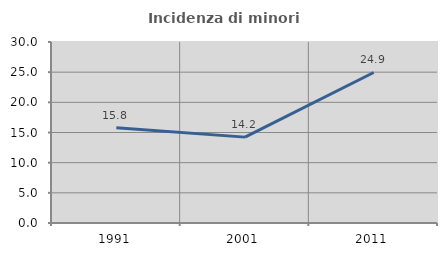
| Category | Incidenza di minori stranieri |
|---|---|
| 1991.0 | 15.789 |
| 2001.0 | 14.234 |
| 2011.0 | 24.948 |